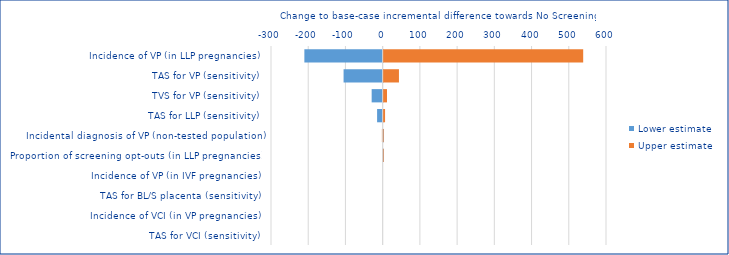
| Category | Lower estimate | Upper estimate |
|---|---|---|
| Incidence of VP (in LLP pregnancies) | -210.349 | 536.042 |
| TAS for VP (sensitivity) | -105.024 | 41.059 |
| TVS for VP (sensitivity) | -29.576 | 8.92 |
| TAS for LLP (sensitivity) | -14.981 | 3.745 |
| Incidental diagnosis of VP (non-tested population) | 0.369 | -2.078 |
| Proportion of screening opt-outs (in LLP pregnancies) | 0.03 | -0.173 |
| Incidence of VP (in IVF pregnancies) | 0 | 0 |
| TAS for BL/S placenta (sensitivity) | 0 | 0 |
| Incidence of VCI (in VP pregnancies) | 0 | 0 |
| TAS for VCI (sensitivity) | 0 | 0 |